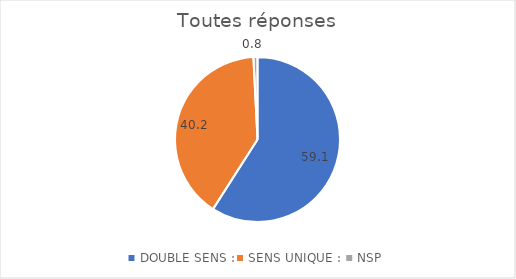
| Category | Series 0 |
|---|---|
| DOUBLE SENS : | 59.055 |
| SENS UNIQUE :  | 40.157 |
| NSP | 0.787 |